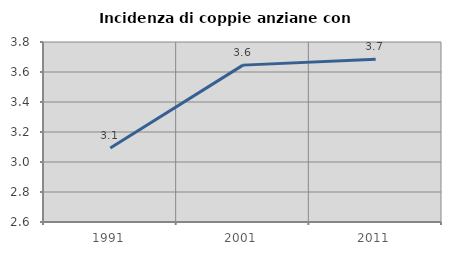
| Category | Incidenza di coppie anziane con figli |
|---|---|
| 1991.0 | 3.093 |
| 2001.0 | 3.646 |
| 2011.0 | 3.684 |